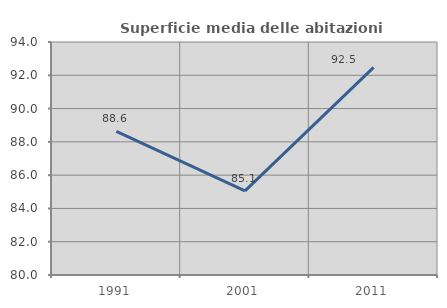
| Category | Superficie media delle abitazioni occupate |
|---|---|
| 1991.0 | 88.627 |
| 2001.0 | 85.053 |
| 2011.0 | 92.478 |